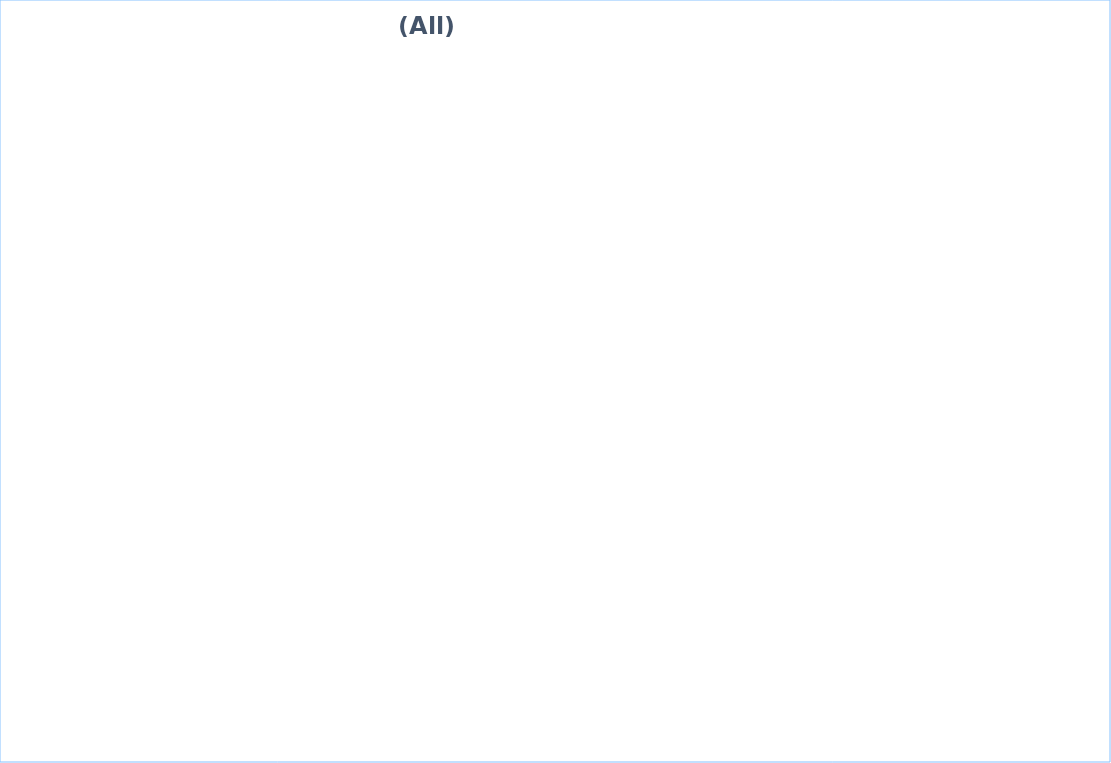
| Category | Total Population | Number of People adopt basic personal and community hygiene practices | Number of people with equitable and continuous access to safe sanitation facilities | Number of people with equitable and continuous access to sufficient quantity of domestic water |
|---|---|---|---|---|
| 0 | 964 | 54 | 600 | 964 |
| 1 | 2306 | 0 | 0 | 0 |
| 2 | 10084 | 608 | 2740 | 4844 |
| 3 | 3741 | 0 | 0 | 0 |
| 4 | 413 | 228 | 320 | 170 |
| 5 | 1342 | 816 | 1262 | 260 |
| 6 | 1209 | 489 | 18 | 0 |
| 7 | 871 | 436 | 0 | 0 |
| 8 | 937 | 105 | 0 | 0 |
| 9 | 617 | 75 | 156 | 0 |
| 10 | 272 | 103 | 0 | 0 |
| 11 | 5336 | 0 | 819 | 0 |
| 12 | 4563 | 0 | 1494 | 0 |
| 13 | 291 | 67 | 42 | 0 |
| 14 | 4171 | 0 | 812 | 2624 |
| 15 | 3451 | 0 | 323 | 323 |
| 16 | 20186 | 253 | 8650 | 14886 |
| 17 | 49926 | 1443 | 25618 | 49926 |
| 18 | 434 | 434 | 434 | 434 |
| 19 | 30582 | 13381 | 2580 | 30582 |
| 20 | 170635 | 56431 | 51810 | 129162 |
| 21 | 7593 | 0 | 4602 | 7144 |